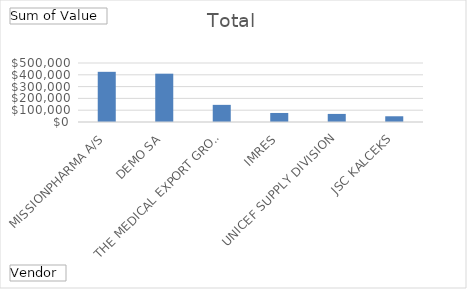
| Category | Total |
|---|---|
| MISSIONPHARMA A/S | 425265.5 |
| DEMO SA | 409500 |
| THE MEDICAL EXPORT GROUP BV | 145250 |
| IMRES | 76562.5 |
| UNICEF SUPPLY DIVISION | 68462.71 |
| JSC KALCEKS | 48561 |